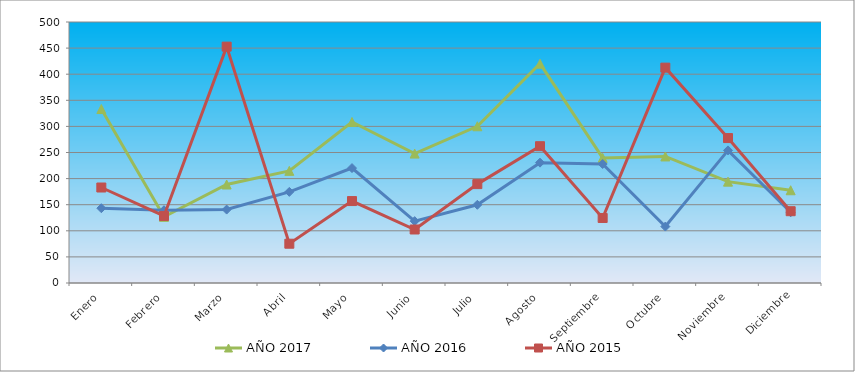
| Category | AÑO 2017 | AÑO 2016 | AÑO 2015 |
|---|---|---|---|
| Enero | 333.303 | 143.288 | 182.939 |
| Febrero | 126.71 | 139.38 | 128.447 |
| Marzo | 188.688 | 140.682 | 452.807 |
| Abril | 214.857 | 174.55 | 75.252 |
| Mayo | 308.512 | 220.142 | 156.99 |
| Junio | 247.911 | 118.538 | 102.498 |
| Julio | 300.248 | 149.801 | 189.426 |
| Agosto | 420.072 | 230.563 | 262.083 |
| Septiembre | 239.648 | 227.957 | 124.554 |
| Octubre | 242.402 | 108.117 | 412.586 |
| Noviembre | 194.197 | 254.01 | 277.652 |
| Diciembre | 177.67 | 135.472 | 137.529 |